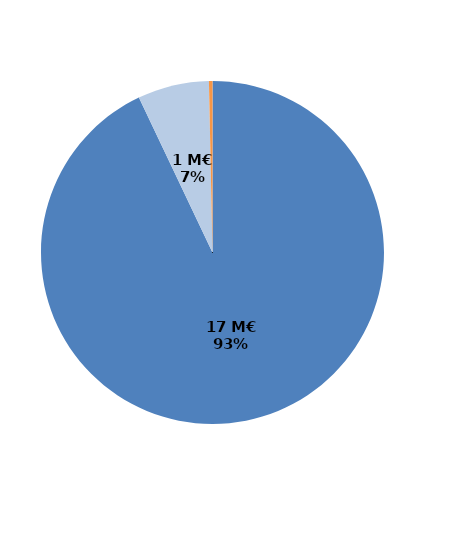
| Category | Series 0 |
|---|---|
| Formations certifiantes et pré-certifiantes | 16.85 |
| Formations professionnalisantes | 1.219 |
| Formations d'insertion sociale et professionnelle | 0.06 |